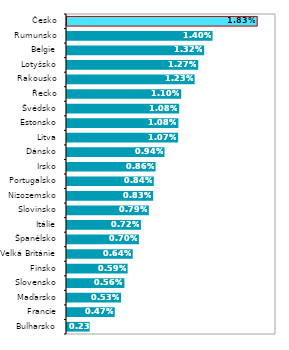
| Category | podíl na HDP |
|---|---|
| Bulharsko | 0.002 |
| Francie | 0.005 |
| Maďarsko | 0.005 |
| Slovensko | 0.006 |
| Finsko | 0.006 |
| Velká Británie | 0.006 |
| Španělsko | 0.007 |
| Itálie | 0.007 |
| Slovinsko | 0.008 |
| Nizozemsko | 0.008 |
| Portugalsko | 0.008 |
| Irsko | 0.009 |
| Dánsko | 0.009 |
| Litva | 0.011 |
| Estonsko | 0.011 |
| Švédsko | 0.011 |
| Řecko | 0.011 |
| Rakousko | 0.012 |
| Lotyšsko | 0.013 |
| Belgie | 0.013 |
| Rumunsko | 0.014 |
| Česko | 0.018 |